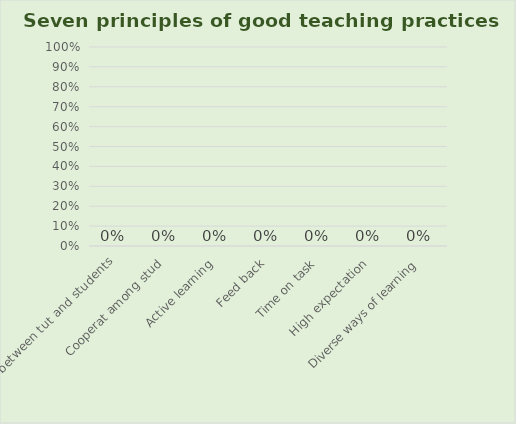
| Category | Series 0 |
|---|---|
| Contact between tut and students | 0 |
| Cooperat among stud | 0 |
| Active learning | 0 |
| Feed back | 0 |
| Time on task | 0 |
| High expectation | 0 |
| Diverse ways of learning | 0 |